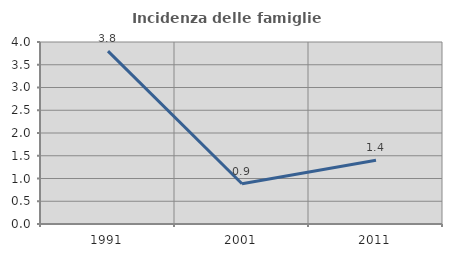
| Category | Incidenza delle famiglie numerose |
|---|---|
| 1991.0 | 3.798 |
| 2001.0 | 0.884 |
| 2011.0 | 1.399 |